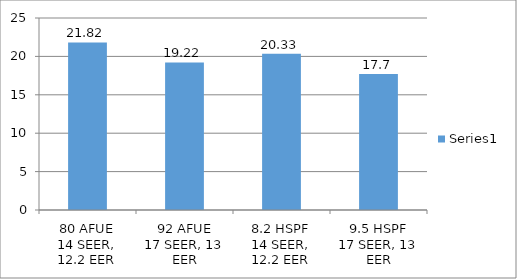
| Category | Series 0 |
|---|---|
| 80 AFUE
14 SEER, 12.2 EER | 21.82 |
| 92 AFUE
17 SEER, 13 EER | 19.22 |
| 8.2 HSPF
14 SEER, 12.2 EER | 20.33 |
| 9.5 HSPF
17 SEER, 13 EER | 17.7 |